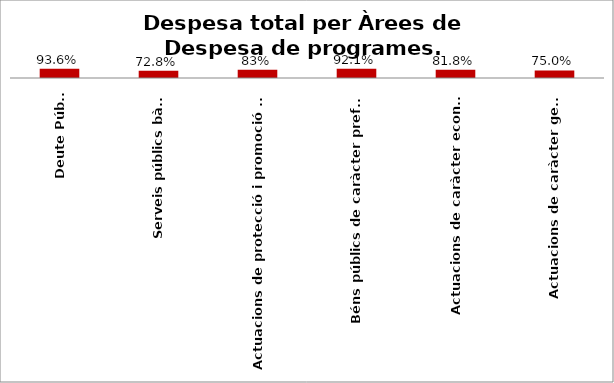
| Category | Series 0 |
|---|---|
| Deute Públic | 0.936 |
| Serveis públics bàsics | 0.728 |
| Actuacions de protecció i promoció social | 0.83 |
| Béns públics de caràcter preferent | 0.921 |
| Actuacions de caràcter econòmic | 0.818 |
| Actuacions de caràcter general | 0.75 |